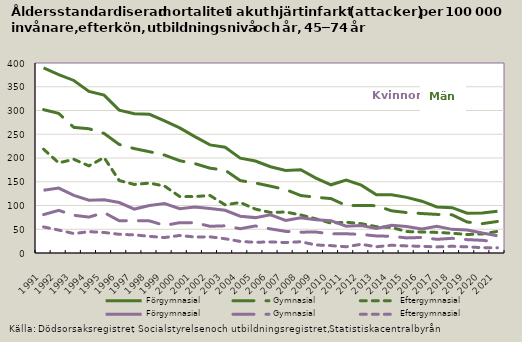
| Category | Förgymnasial | Gymnasial | Eftergymnasial | Eftergymnasial  |
|---|---|---|---|---|
| 1991.0 | 131.894 | 80.821 | 218.561 | 54.891 |
| 1992.0 | 136.595 | 89.733 | 189.757 | 48.28 |
| 1993.0 | 121.329 | 79.395 | 197.285 | 40.899 |
| 1994.0 | 111.092 | 75.638 | 183.447 | 44.893 |
| 1995.0 | 112.271 | 85.082 | 200.976 | 43.264 |
| 1996.0 | 106.201 | 67.873 | 152.57 | 39.308 |
| 1997.0 | 92.514 | 68.19 | 144.316 | 38.218 |
| 1998.0 | 99.845 | 67.6 | 147.169 | 35.03 |
| 1999.0 | 103.93 | 58.058 | 140.893 | 32.519 |
| 2000.0 | 93.09 | 63.889 | 118.845 | 36.874 |
| 2001.0 | 96.743 | 63.951 | 118.759 | 33.696 |
| 2002.0 | 93.525 | 56.202 | 121.118 | 34.087 |
| 2003.0 | 90.035 | 57.243 | 101.435 | 30.014 |
| 2004.0 | 77.399 | 51.083 | 106.334 | 24.347 |
| 2005.0 | 74.493 | 56.996 | 92.449 | 22.499 |
| 2006.0 | 80.518 | 50.763 | 85.337 | 23.415 |
| 2007.0 | 68.398 | 45.527 | 86.332 | 21.987 |
| 2008.0 | 74.18 | 43.851 | 80.108 | 23.688 |
| 2009.0 | 69.934 | 44.16 | 71.971 | 16.916 |
| 2010.0 | 68.069 | 40.353 | 62.866 | 15.586 |
| 2011.0 | 56.468 | 40.515 | 64.86 | 13.148 |
| 2012.0 | 57.825 | 39.063 | 61.739 | 18.362 |
| 2013.0 | 51.774 | 35.849 | 55.375 | 13.133 |
| 2014.0 | 58.152 | 35.215 | 53.718 | 16.328 |
| 2015.0 | 55.675 | 31.793 | 45.121 | 14.907 |
| 2016.0 | 50.811 | 32.752 | 44.319 | 14.068 |
| 2017.0 | 56.237 | 28.761 | 43.319 | 12.839 |
| 2018.0 | 49.76 | 30.937 | 41.67 | 14.158 |
| 2019.0 | 48.368 | 28.127 | 38.921 | 12.944 |
| 2020.0 | 41.907 | 26.766 | 40.108 | 11.198 |
| 2021.0 | 36.411 | 23 | 45.439 | 11 |